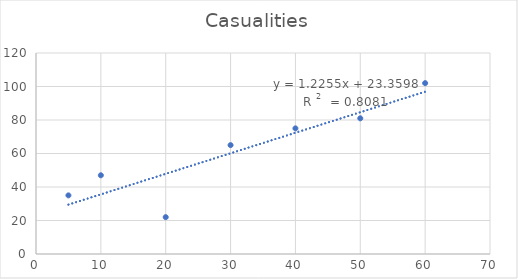
| Category | Casualities |
|---|---|
| 5.0 | 35 |
| 10.0 | 47 |
| 20.0 | 22 |
| 30.0 | 65 |
| 40.0 | 75 |
| 50.0 | 81 |
| 60.0 | 102 |